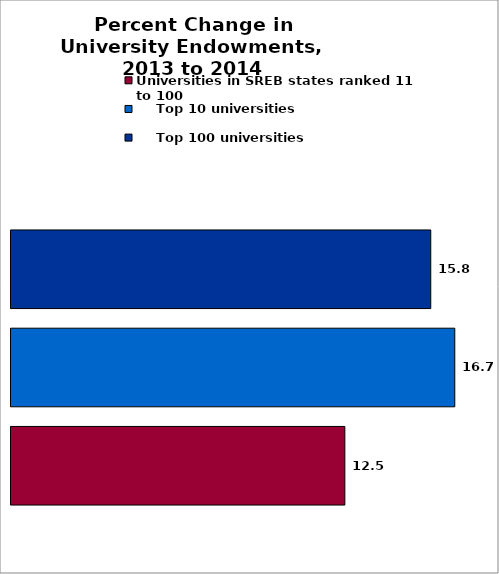
| Category | Universities in SREB states ranked 11 to 100 |     Top 10 universities |     Top 100 universities |
|---|---|---|---|
| 0 | 12.546 | 16.677 | 15.773 |